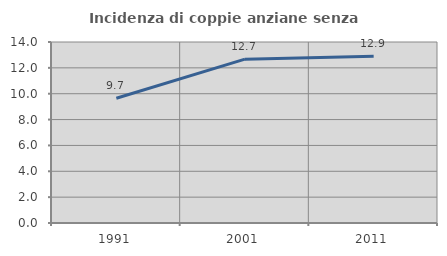
| Category | Incidenza di coppie anziane senza figli  |
|---|---|
| 1991.0 | 9.652 |
| 2001.0 | 12.671 |
| 2011.0 | 12.903 |